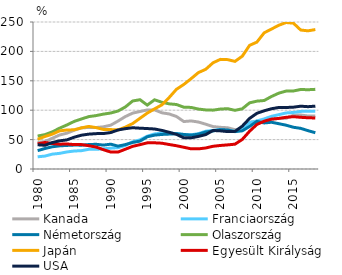
| Category | Kanada | Franciaország | Németország | Olaszország | Japán | Egyesült Királyság | USA |
|---|---|---|---|---|---|---|---|
| 1980.0 | 45.41 | 20.76 | 31.25 | 56.08 | 50.63 | 42.77 | 41.18 |
| 1981.0 | 46.56 | 21.97 | 34.86 | 58.46 | 55.29 | 45.09 | 40.33 |
| 1982.0 | 52.26 | 25.27 | 37.79 | 63.14 | 59.26 | 43.39 | 44.98 |
| 1983.0 | 57.84 | 26.59 | 39.38 | 69.4 | 64.83 | 42.18 | 47.85 |
| 1984.0 | 60.87 | 28.99 | 40.09 | 74.9 | 66.34 | 42.59 | 49.51 |
| 1985.0 | 65.88 | 30.58 | 40.69 | 80.9 | 66.67 | 41.54 | 54.09 |
| 1986.0 | 70.1 | 31.18 | 40.54 | 85.12 | 69.93 | 41.52 | 57.52 |
| 1987.0 | 70.55 | 33.53 | 41.6 | 89.11 | 72.46 | 39.62 | 59.28 |
| 1988.0 | 70.52 | 33.48 | 42.03 | 90.83 | 70.35 | 37.34 | 60.15 |
| 1989.0 | 71.76 | 34.27 | 40.65 | 93.31 | 67.3 | 32.81 | 60.28 |
| 1990.0 | 74.53 | 35.41 | 42.25 | 95.22 | 67.04 | 28.82 | 61.99 |
| 1991.0 | 81.54 | 36.3 | 38.89 | 98.59 | 66.49 | 28.8 | 66.37 |
| 1992.0 | 89.18 | 40.01 | 41.52 | 105.49 | 71.22 | 33.66 | 68.61 |
| 1993.0 | 95.04 | 46.3 | 45.12 | 115.66 | 77.27 | 38.53 | 70.19 |
| 1994.0 | 97.78 | 49.61 | 47.42 | 117.87 | 86.22 | 41.42 | 69.39 |
| 1995.0 | 100.4 | 55.81 | 54.82 | 108.69 | 95.07 | 44.45 | 68.8 |
| 1996.0 | 100.57 | 59.68 | 57.6 | 117.71 | 102.29 | 44.55 | 68.03 |
| 1997.0 | 95.59 | 61.1 | 58.77 | 113.43 | 109.1 | 43.87 | 65.62 |
| 1998.0 | 93.61 | 61.04 | 59.38 | 110.81 | 121.63 | 41.64 | 62.47 |
| 1999.0 | 89.27 | 60.22 | 59.96 | 109.66 | 135.61 | 39.55 | 58.88 |
| 2000.0 | 80.71 | 58.65 | 58.76 | 105.11 | 143.78 | 36.98 | 53.03 |
| 2001.0 | 81.75 | 58.16 | 57.58 | 104.73 | 153.63 | 34.3 | 53.02 |
| 2002.0 | 79.89 | 60.08 | 59.22 | 101.92 | 163.99 | 34.23 | 55.38 |
| 2003.0 | 76.18 | 64.21 | 62.92 | 100.48 | 169.57 | 35.76 | 58.52 |
| 2004.0 | 72.14 | 65.74 | 64.69 | 100.09 | 180.66 | 38.66 | 65.49 |
| 2005.0 | 70.87 | 67.21 | 66.91 | 101.94 | 186.44 | 40.01 | 64.89 |
| 2006.0 | 70.13 | 64.45 | 66.33 | 102.56 | 186 | 41.02 | 63.64 |
| 2007.0 | 66.84 | 64.4 | 63.54 | 99.78 | 183.01 | 42.21 | 64.01 |
| 2008.0 | 67.83 | 68.06 | 64.93 | 102.39 | 191.81 | 50.27 | 72.85 |
| 2009.0 | 79.28 | 79 | 72.43 | 112.52 | 210.25 | 64.2 | 86.03 |
| 2010.0 | 81.1 | 81.7 | 81 | 115.38 | 215.82 | 75.74 | 94.73 |
| 2011.0 | 81.51 | 85.21 | 78.31 | 116.5 | 231.63 | 81.32 | 98.99 |
| 2012.0 | 84.84 | 89.58 | 79.52 | 123.34 | 238.01 | 84.82 | 102.5 |
| 2013.0 | 86.08 | 92.4 | 77.06 | 129 | 244.48 | 86 | 104.62 |
| 2014.0 | 86.2 | 95.34 | 74.48 | 132.53 | 249.11 | 87.94 | 104.61 |
| 2015.0 | 91.5 | 96.14 | 70.99 | 132.71 | 247.98 | 88.98 | 105.15 |
| 2016.0 | 91.816 | 97.958 | 69.107 | 135.236 | 236.335 | 87.909 | 106.819 |
| 2017.0 | 90.093 | 98.416 | 65.19 | 134.811 | 234.988 | 87.141 | 105.988 |
| 2018.0 | 89.94 | 98.394 | 61.691 | 135.477 | 237.13 | 86.769 | 106.909 |